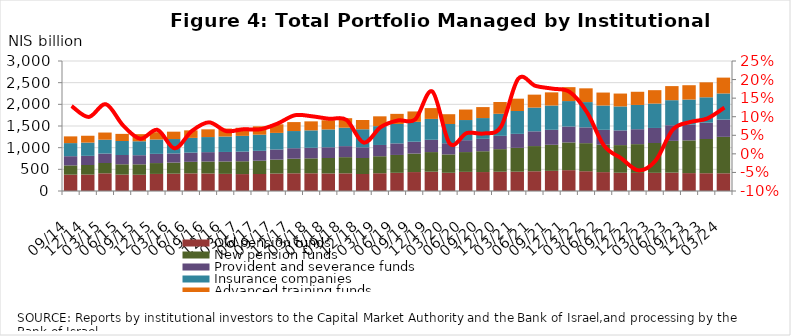
| Category | Old pension funds | New pension funds | Provident and severance funds | Insurance companies | Advanced training funds |
|---|---|---|---|---|---|
| 2014-09-30 | 376835.81 | 214231.406 | 212122.612 | 302166.651 | 155186.364 |
| 2014-12-31 | 379149.747 | 220941.602 | 211145.904 | 306088.457 | 157811.406 |
| 2015-03-31 | 407766.852 | 238480.103 | 217541.262 | 320021.053 | 165379.123 |
| 2015-06-30 | 377998.91 | 238584.047 | 213964.644 | 323046.986 | 164673.63 |
| 2015-09-30 | 375003.671 | 240239.995 | 210631.449 | 321958.368 | 164024.895 |
| 2015-12-31 | 394009.261 | 250710.3 | 212571.186 | 330789.846 | 169409.673 |
| 2016-03-31 | 399560.392 | 256138.452 | 210717.212 | 332791.969 | 169965.765 |
| 2016-06-30 | 407029.119 | 266330.142 | 212719.128 | 339548.345 | 173857.09 |
| 2016-09-30 | 404282.94 | 276548.745 | 215975.352 | 347964.478 | 178395.11 |
| 2016-12-31 | 395218.356 | 286472.786 | 219236.832 | 355928.441 | 183799.701 |
| 2017-03-31 | 390378.339 | 295724.533 | 222912.57 | 363011.334 | 187566.428 |
| 2017-06-30 | 391709.081 | 307141.439 | 228329.728 | 372231.012 | 192874.939 |
| 2017-09-30 | 402740.093 | 321661.487 | 233741.441 | 382646.482 | 198731.491 |
| 2017-12-31 | 408397.183 | 337110.231 | 241863.688 | 396293.151 | 206768.207 |
| 2018-03-31 | 408963.351 | 344950.856 | 243400.808 | 402045.85 | 207767.029 |
| 2018-06-30 | 404980.359 | 356723.509 | 247271.377 | 412065.083 | 212149.531 |
| 2018-09-30 | 407549.506 | 373583.03 | 254365.581 | 424811.464 | 219817.214 |
| 2018-12-31 | 392610.35 | 369066.721 | 247165.547 | 415663.942 | 214152.19 |
| 2019-03-31 | 409682.434 | 392949.873 | 259599.347 | 435130.795 | 225972.39 |
| 2019-06-30 | 419699.746 | 412238.813 | 266829.127 | 448024.74 | 233337.284 |
| 2019-09-30 | 436873.365 | 427408.051 | 273305.515 | 458457.617 | 239774.326 |
| 2019-12-31 | 445070.178 | 453159.976 | 283994.45 | 481206.961 | 250173.86 |
| 2020-03-31 | 420264.639 | 424460.557 | 257990.521 | 443809.629 | 225647.442 |
| 2020-06-30 | 441583.014 | 456963.565 | 274382.869 | 464715.564 | 242032.798 |
| 2020-09-30 | 437471.661 | 480207.453 | 285869.533 | 479529.895 | 253459.669 |
| 2020-12-31 | 444730.312 | 521341.893 | 307058.721 | 508635.702 | 272631.199 |
| 2021-03-31 | 445846.383 | 549551.75 | 323387.197 | 527059.137 | 284834.843 |
| 2021-06-30 | 455642.782 | 581354.211 | 340022.339 | 547917.213 | 298732.086 |
| 2021-09-30 | 464891.868 | 601622.772 | 346161.906 | 559765.909 | 303953.763 |
| 2021-12-31 | 481035.907 | 640332.283 | 367096.291 | 586510.775 | 321477.273 |
| 2022-03-31 | 456364.834 | 647866.377 | 364714.734 | 582900.247 | 317423.711 |
| 2022-06-30 | 435454.051 | 632258.662 | 344442.779 | 560247.736 | 299535.625 |
| 2022-09-30 | 422096.78 | 637197.331 | 338973.173 | 553689.087 | 296831.372 |
| 2022-12-31 | 418242.028 | 663252.805 | 344241.884 | 560064.527 | 304118.618 |
| 2023-03-31 | 419238.201 | 688496.181 | 347290.177 | 562771.855 | 308995.303 |
| 2023-06-30 | 424281.593 | 732625.871 | 361541.166 | 577640.063 | 324662.57 |
| 2023-09-30 | 412695.235 | 755112.415 | 365402.219 | 577636.283 | 330381.458 |
| 2023-12-31 | 409939.408 | 789872.143 | 377256.66 | 585687.161 | 345155.591 |
| 2024-03-31 | 408271.935 | 841346.738 | 398778.216 | 602679.974 | 365520.187 |